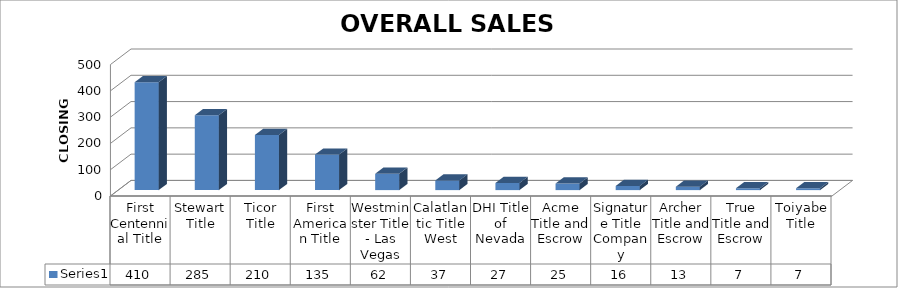
| Category | Series 0 |
|---|---|
| First Centennial Title | 410 |
| Stewart Title | 285 |
| Ticor Title | 210 |
| First American Title | 135 |
| Westminster Title - Las Vegas | 62 |
| Calatlantic Title West | 37 |
| DHI Title of Nevada | 27 |
| Acme Title and Escrow | 25 |
| Signature Title Company | 16 |
| Archer Title and Escrow | 13 |
| True Title and Escrow | 7 |
| Toiyabe Title | 7 |